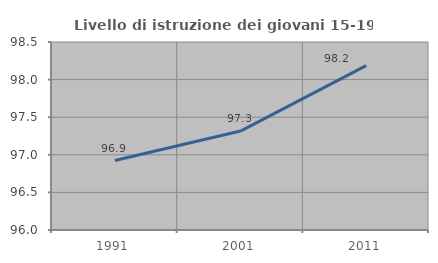
| Category | Livello di istruzione dei giovani 15-19 anni |
|---|---|
| 1991.0 | 96.923 |
| 2001.0 | 97.315 |
| 2011.0 | 98.185 |